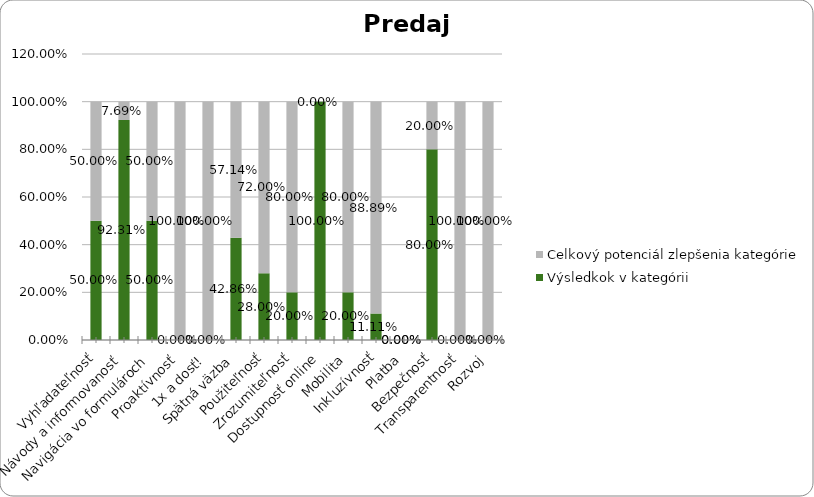
| Category | Výsledkok v kategórii | Celkový potenciál zlepšenia kategórie |
|---|---|---|
| Vyhľadateľnosť | 0.5 | 0.5 |
| Návody a informovanosť | 0.923 | 0.077 |
| Navigácia vo formulároch | 0.5 | 0.5 |
| Proaktívnosť | 0 | 1 |
| 1x a dosť! | 0 | 1 |
| Spätná väzba | 0.429 | 0.571 |
| Použiteľnosť | 0.28 | 0.72 |
| Zrozumiteľnosť | 0.2 | 0.8 |
| Dostupnosť online | 1 | 0 |
| Mobilita | 0.2 | 0.8 |
| Inkluzívnosť | 0.111 | 0.889 |
| Platba | 0 | 0 |
| Bezpečnosť | 0.8 | 0.2 |
| Transparentnosť | 0 | 1 |
| Rozvoj | 0 | 1 |